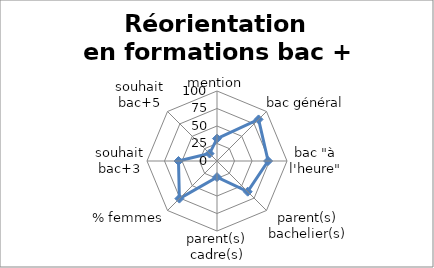
| Category | Réorientation en formations bac + 3 |
|---|---|
| mention | 32 |
| bac général | 84 |
| bac "à l'heure" | 73 |
| parent(s) bachelier(s) | 62 |
| parent(s) cadre(s) | 23 |
| % femmes | 76 |
| souhait bac+3 | 55 |
| souhait bac+5 | 15 |